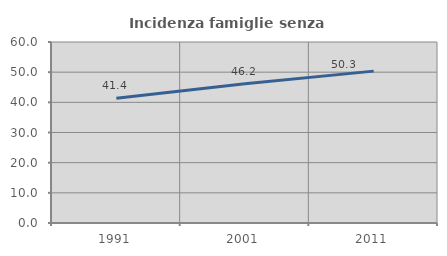
| Category | Incidenza famiglie senza nuclei |
|---|---|
| 1991.0 | 41.35 |
| 2001.0 | 46.154 |
| 2011.0 | 50.345 |